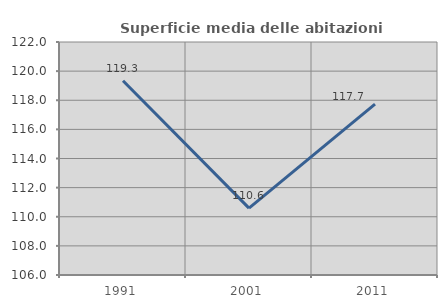
| Category | Superficie media delle abitazioni occupate |
|---|---|
| 1991.0 | 119.338 |
| 2001.0 | 110.589 |
| 2011.0 | 117.729 |